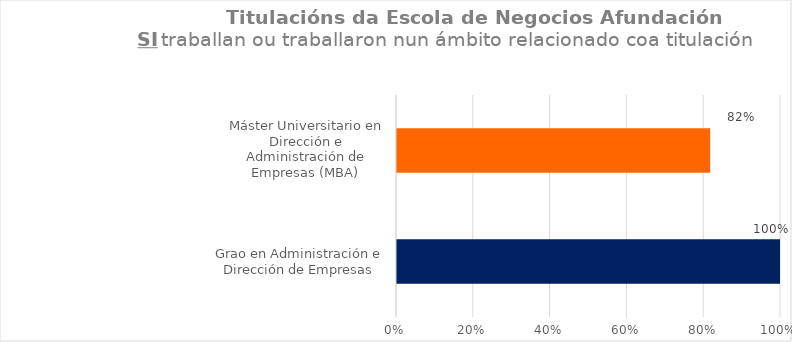
| Category | Series 1 |
|---|---|
| Grao en Administración e Dirección de Empresas | 1 |
| Máster Universitario en Dirección e Administración de Empresas (MBA) | 0.818 |